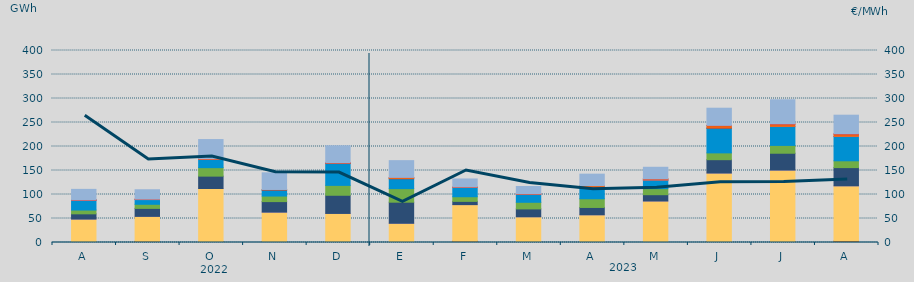
| Category | Carbón | Ciclo Combinado | Cogeneración | Consumo Bombeo | Eólica | Hidráulica | Nuclear | Otras Renovables | Solar fotovoltaica | Solar térmica | Turbinación bombeo |
|---|---|---|---|---|---|---|---|---|---|---|---|
| A | 608.425 | 48201.184 | 25.75 | 10881.743 | 7912.923 | 20661.25 | 49.5 | 8.225 | 251.425 | 88.725 | 21982.08 |
| S | 2432.475 | 52018.85 | 0.5 | 16627 | 8549.825 | 9810.3 | 0 | 23 | 777.175 | 6.75 | 19642.325 |
| O | 1876.1 | 110603.205 | 45 | 25745.4 | 17659.375 | 17006.05 | 12.825 | 16.6 | 1409.775 | 15.5 | 40055.836 |
| N | 1396.025 | 61724.955 | 198.008 | 21869.975 | 11579.495 | 12449.175 | 266.725 | 0 | 996.225 | 0 | 34713.224 |
| D | 1126.208 | 59335.684 | 104.85 | 37837.8 | 20596.98 | 45465.168 | 544.3 | 0 | 1011.875 | 1.5 | 35471.986 |
| E | 478.95 | 39560.875 | 26.867 | 43909.242 | 28275.092 | 20601.292 | 143.6 | 0 | 2603.242 | 1.5 | 34937.333 |
| F | 2850.925 | 76083.275 | 1.55 | 6739.65 | 9661.175 | 19240.1 | 0 | 0 | 962.675 | 47.25 | 16781.025 |
| M | 1195.025 | 52392.533 | 3.3 | 16393.158 | 13789.6 | 16980.517 | 40.625 | 4.5 | 911.6 | 43.15 | 14940.475 |
| A | 218.875 | 57485.65 | 46.225 | 15258.175 | 18096.25 | 24086.65 | 63.45 | 0 | 3316.075 | 0 | 23819.559 |
| M | 150.482 | 86315.465 | 30 | 13099.874 | 12607.441 | 17784.926 | 256.325 | 2 | 2256.963 | 1.5 | 24199.004 |
| J | 1968.975 | 142738.351 | 35.225 | 27797.375 | 14167.175 | 51399.925 | 228.125 | 0 | 5290.65 | 319.5 | 35835.25 |
| J | 1606.69 | 149175.946 | 137.975 | 35048.925 | 16290.2 | 39637.497 | 0 | 5 | 4774.95 | 398.125 | 50276.3 |
| A | 2991.569 | 115032.711 | 108.25 | 37912.341 | 14171.547 | 50649.252 | 261.175 | 69.9 | 4696.2 | 414.625 | 38918.209 |